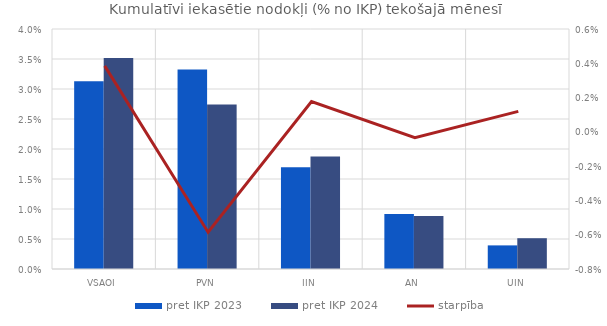
| Category | pret IKP 2023 | pret IKP 2024 |
|---|---|---|
| VSAOI | 0.031 | 0.035 |
| PVN | 0.033 | 0.027 |
| IIN | 0.017 | 0.019 |
| AN | 0.009 | 0.009 |
| UIN | 0.004 | 0.005 |